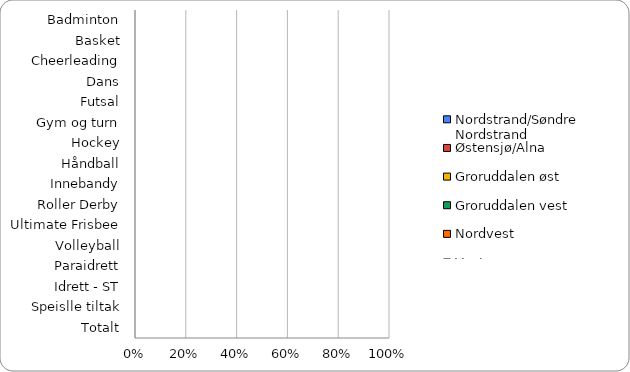
| Category | Nordstrand/Søndre Nordstrand | Østensjø/Alna | Groruddalen øst | Groruddalen vest | Nordvest | Vest | Indre by øst |
|---|---|---|---|---|---|---|---|
| Badminton | 0 | 0 | 0 | 0 | 0 | 0 | 0 |
| Basket | 0 | 0 | 0 | 0 | 0 | 0 | 0 |
| Cheerleading | 0 | 0 | 0 | 0 | 0 | 0 | 0 |
| Dans | 0 | 0 | 0 | 0 | 0 | 0 | 0 |
| Futsal | 0 | 0 | 0 | 0 | 0 | 0 | 0 |
| Gym og turn | 0 | 0 | 0 | 0 | 0 | 0 | 0 |
| Hockey | 0 | 0 | 0 | 0 | 0 | 0 | 0 |
| Håndball | 0 | 0 | 0 | 0 | 0 | 0 | 0 |
| Innebandy | 0 | 0 | 0 | 0 | 0 | 0 | 0 |
| Roller Derby | 0 | 0 | 0 | 0 | 0 | 0 | 0 |
| Ultimate Frisbee | 0 | 0 | 0 | 0 | 0 | 0 | 0 |
| Volleyball | 0 | 0 | 0 | 0 | 0 | 0 | 0 |
| Paraidrett | 0 | 0 | 0 | 0 | 0 | 0 | 0 |
| Idrett - ST | 0 | 0 | 0 | 0 | 0 | 0 | 0 |
| Speislle tiltak | 0 | 0 | 0 | 0 | 0 | 0 | 0 |
| Totalt | 0 | 0 | 0 | 0 | 0 | 0 | 0 |